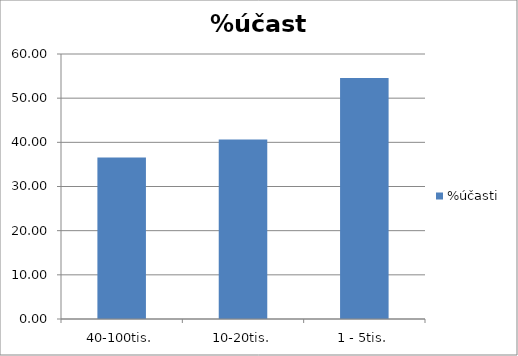
| Category | %účasti |
|---|---|
| 40-100tis. | 36.55 |
| 10-20tis. | 40.669 |
| 1 - 5tis. | 54.581 |